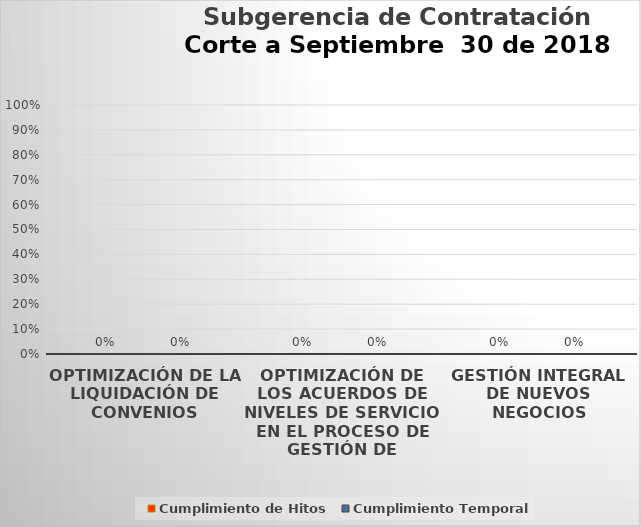
| Category | Cumplimiento de Hitos | Cumplimiento Temporal |
|---|---|---|
| OPTIMIZACIÓN DE LA LIQUIDACIÓN DE CONVENIOS | 0 | 0 |
| OPTIMIZACIÓN DE LOS ACUERDOS DE NIVELES DE SERVICIO EN EL PROCESO DE GESTIÓN DE PROVEEDORES | 0 | 0 |
| GESTIÓN INTEGRAL DE NUEVOS NEGOCIOS | 0 | 0 |